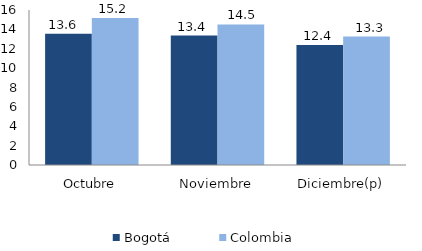
| Category | Bogotá | Colombia |
|---|---|---|
| Octubre | 13.555 | 15.174 |
| Noviembre | 13.359 | 14.507 |
| Diciembre(p) | 12.38 | 13.258 |